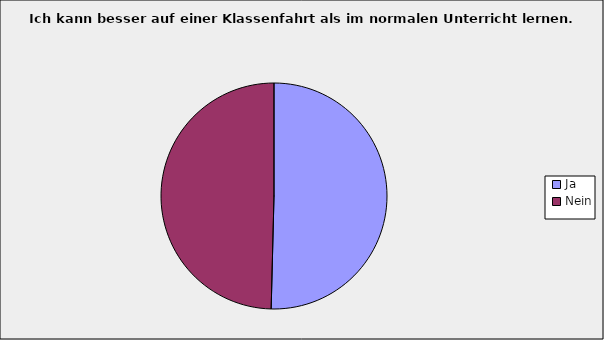
| Category | Series 0 |
|---|---|
| Ja | 0.504 |
| Nein | 0.496 |